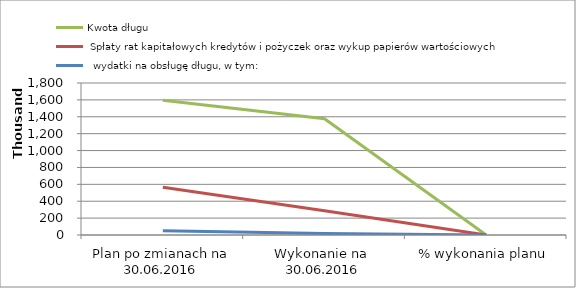
| Category | Kwota długu |  Spłaty rat kapitałowych kredytów i pożyczek oraz wykup papierów wartościowych |   wydatki na obsługę długu, w tym: |
|---|---|---|---|
| Plan po zmianach na 30.06.2016 | 1594599.78 | 564362 | 50000 |
| Wykonanie na  30.06.2016 | 1376423.38 | 286298.4 | 17865.58 |
| % wykonania planu | 0 | 0.507 | 0.357 |